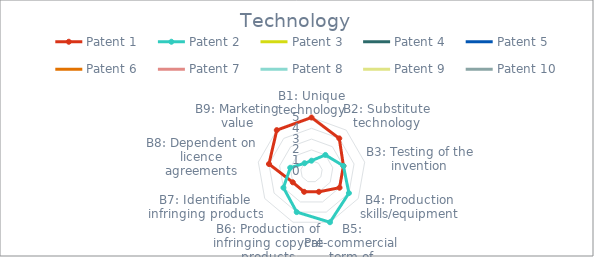
| Category | Patent 1 | Patent 2 | Patent 3 | Patent 4 | Patent 5 | Patent 6 | Patent 7 | Patent 8 | Patent 9 | Patent 10 |
|---|---|---|---|---|---|---|---|---|---|---|
| B1: Unique technology | 5 | 1 | 0 | 0 | 0 | 0 | 0 | 0 | 0 | 0 |
| B2: Substitute technology | 4 | 2 | 0 | 0 | 0 | 0 | 0 | 0 | 0 | 0 |
| B3: Testing of the invention | 3 | 3 | 0 | 0 | 0 | 0 | 0 | 0 | 0 | 0 |
| B4: Production skills/equipment | 3 | 4 | 0 | 0 | 0 | 0 | 0 | 0 | 0 | 0 |
| B5: Pre-commercial term of development | 2 | 5 | 0 | 0 | 0 | 0 | 0 | 0 | 0 | 0 |
| B6: Production of infringing copycat products | 2 | 4 | 0 | 0 | 0 | 0 | 0 | 0 | 0 | 0 |
| B7: Identifiable infringing products | 2 | 3 | 0 | 0 | 0 | 0 | 0 | 0 | 0 | 0 |
| B8: Dependent on licence agreements | 4 | 2 | 0 | 0 | 0 | 0 | 0 | 0 | 0 | 0 |
| B9: Marketing value | 5 | 1 | 0 | 0 | 0 | 0 | 0 | 0 | 0 | 0 |